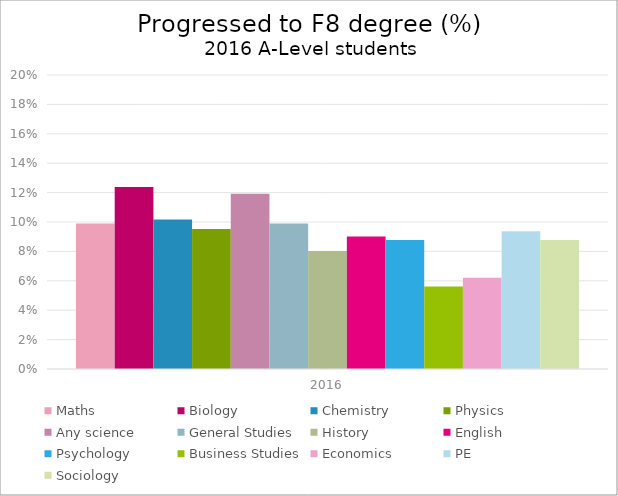
| Category | Maths | Biology | Chemistry | Physics | Any science | General Studies | History | English | Psychology | Business Studies | Economics | PE | Sociology |
|---|---|---|---|---|---|---|---|---|---|---|---|---|---|
| 2016.0 | 0.099 | 0.124 | 0.102 | 0.095 | 0.119 | 0.099 | 0.08 | 0.09 | 0.088 | 0.056 | 0.062 | 0.094 | 0.088 |